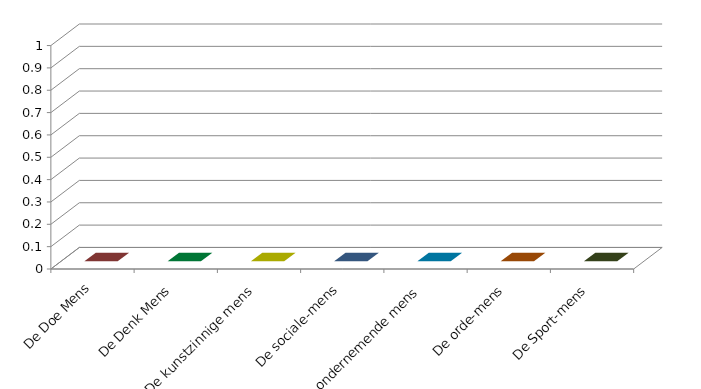
| Category | Series 0 |
|---|---|
| De Doe Mens | 0 |
| De Denk Mens | 0 |
| De kunstzinnige mens | 0 |
| De sociale-mens | 0 |
| De ondernemende mens | 0 |
| De orde-mens | 0 |
| De Sport-mens | 0 |